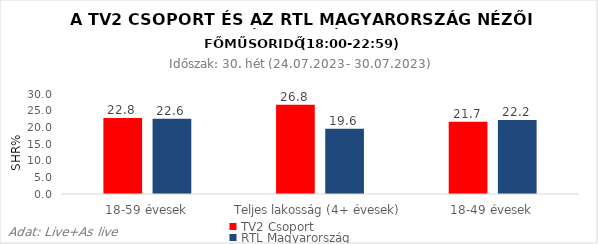
| Category | TV2 Csoport | RTL Magyarország |
|---|---|---|
| 18-59 évesek | 22.8 | 22.6 |
| Teljes lakosság (4+ évesek) | 26.8 | 19.6 |
| 18-49 évesek | 21.7 | 22.2 |